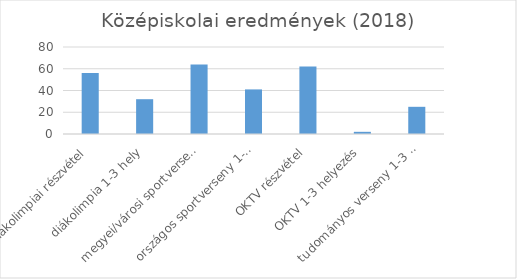
| Category | Series 0 |
|---|---|
| diákolimpiai részvétel | 56 |
| diákolimpia 1-3 hely | 32 |
| megyei/városi sportverseny 1-3 hely | 64 |
| országos sportverseny 1-3 hely | 41 |
| OKTV részvétel | 62 |
| OKTV 1-3 helyezés | 2 |
| tudományos verseny 1-3 helyezés | 25 |